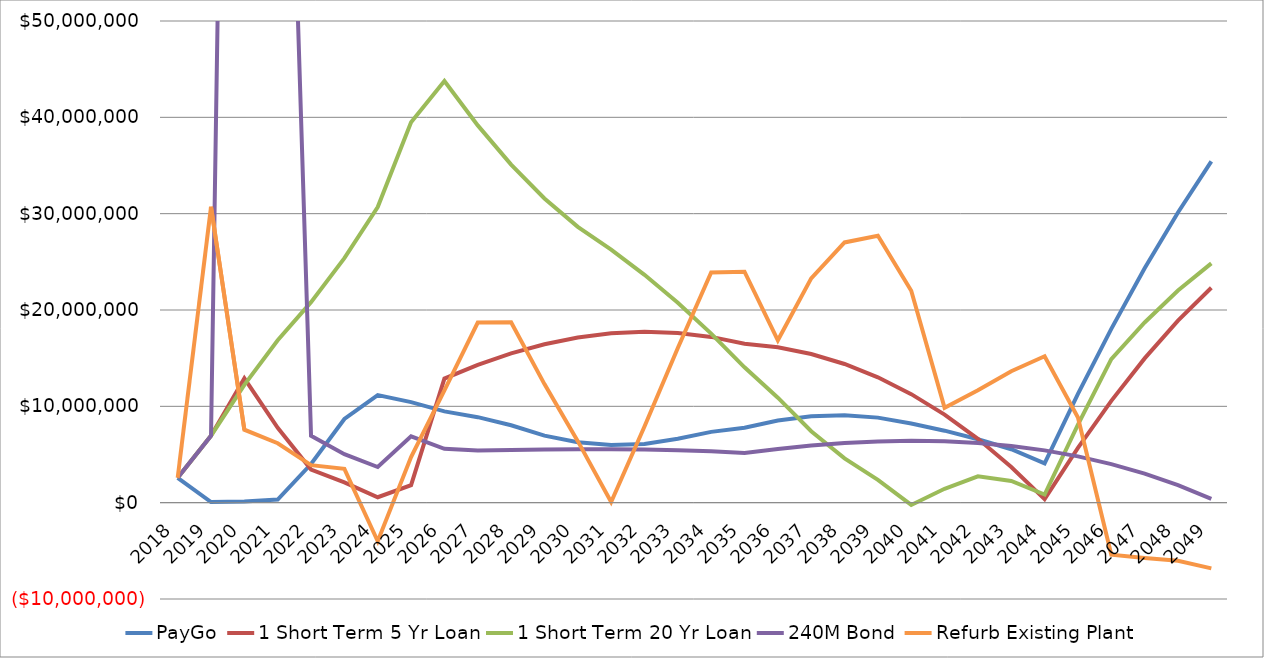
| Category | PayGo | 1 Short Term 5 Yr Loan | 1 Short Term 20 Yr Loan | 240M Bond | Refurb Existing Plant |
|---|---|---|---|---|---|
| 2018.0 | 2580780.74 | 2580780.74 | 2580780.74 | 2580780.74 |  |
| 2019.0 | 60269.81 | 6949690.9 | 6949690.9 | 6949690.9 |  |
| 2020.0 | 132455.95 | 12901982.348 | 12224061.294 | 226224061.294 |  |
| 2021.0 | 320098.617 | 7773751.385 | 16863106.64 | 116982715.852 |  |
| 2022.0 | 4012462.203 | 3443136.505 | 20814443.038 | 6942641.924 |  |
| 2023.0 | 8687811.882 | 2105560.947 | 25379214.17 | 5026932.213 |  |
| 2024.0 | 11160404.388 | 565228.218 | 30686699.203 | 3699222.955 |  |
| 2025.0 | 10433103.458 | 1815002.051 | 39479212.037 | 6881209.697 |  |
| 2026.0 | 9473369.908 | 12882048.032 | 43768535.733 | 5585538.889 |  |
| 2027.0 | 8874571.356 | 14310029.011 | 39163211.432 | 5421645.275 |  |
| 2028.0 | 8039411.558 | 15501648.744 | 35091997.482 | 5477288.513 |  |
| 2029.0 | 6960004.348 | 16449021.064 | 31573974.225 | 5521192.37 |  |
| 2030.0 | 6268942.171 | 17143938.418 | 28628844.44 | 5547474.37 |  |
| 2031.0 | 5976908.193 | 17577859.97 | 26276954.488 | 5549942.011 |  |
| 2032.0 | 6094816.691 | 17741899.278 | 23655182.29 | 5522080.664 |  |
| 2033.0 | 6628817.561 | 17621811.498 | 20749283.005 | 5452041.017 |  |
| 2034.0 | 7350092.205 | 17208180.127 | 17549840.129 | 5332826.056 |  |
| 2035.0 | 7773021.345 | 16496203.252 | 14052051.749 | 5162077.551 |  |
| 2036.0 | 8537203.398 | 16125479.291 | 10895516.283 | 5581862.038 |  |
| 2037.0 | 8975822.323 | 15429192.2 | 7413417.687 | 5927856.276 |  |
| 2038.0 | 9076832.282 | 14395296.145 | 4604148.847 | 6190532.157 |  |
| 2039.0 | 8827741.744 | 13011299.593 | 2364278.747 | 6359941.057 |  |
| 2040.0 | 8215596.992 | 11264248.825 | -238645.568 | 6425697.591 |  |
| 2041.0 | 7472181.873 | 9140710.837 | 1441942.896 | 6376962.772 |  |
| 2042.0 | 6586018.531 | 6626755.601 | 2732114.111 | 6202426.533 |  |
| 2043.0 | 5545138.216 | 3707937.678 | 2257877.341 | 5890289.592 |  |
| 2044.0 | 4084415.296 | 369277.149 | 847170.752 | 5428244.65 |  |
| 2045.0 | 11288315.594 | 5695239.838 | 8101087.38 | 4803456.878 |  |
| 2046.0 | 18040730.168 | 10569716.804 | 14903518.285 | 4002543.673 |  |
| 2047.0 | 24324954.048 | 14976003.075 | 18706285.149 | 3011553.667 |  |
| 2048.0 | 30123664.177 | 18896775.596 | 22023538.261 | 1815944.942 |  |
| 2049.0 | 35418896.546 | 22314070.357 | 24837313.615 | 400562.441 |  |